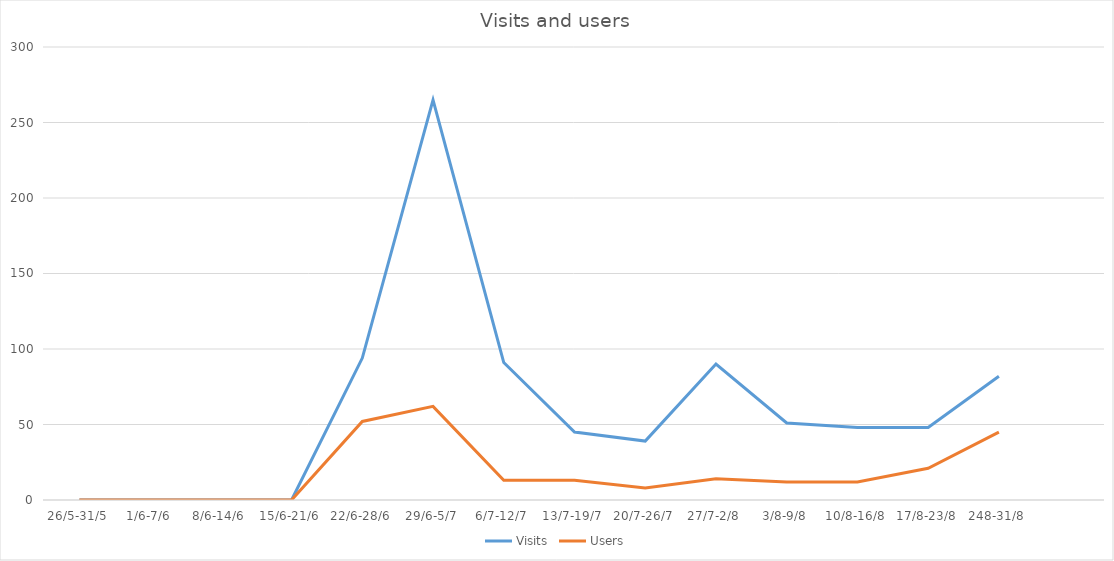
| Category | Visits | Users |
|---|---|---|
| 26/5-31/5 | 0 | 0 |
| 1/6-7/6 | 0 | 0 |
| 8/6-14/6 | 0 | 0 |
| 15/6-21/6 | 0 | 0 |
| 22/6-28/6 | 94 | 52 |
| 29/6-5/7 | 265 | 62 |
| 6/7-12/7 | 91 | 13 |
| 13/7-19/7 | 45 | 13 |
| 20/7-26/7 | 39 | 8 |
| 27/7-2/8 | 90 | 14 |
| 3/8-9/8 | 51 | 12 |
| 10/8-16/8 | 48 | 12 |
| 17/8-23/8 | 48 | 21 |
| 248-31/8 | 82 | 45 |